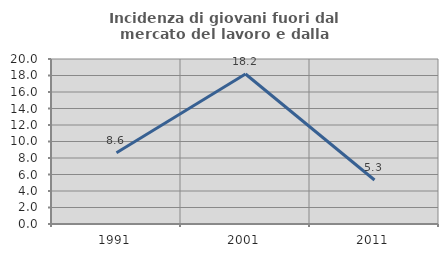
| Category | Incidenza di giovani fuori dal mercato del lavoro e dalla formazione  |
|---|---|
| 1991.0 | 8.642 |
| 2001.0 | 18.182 |
| 2011.0 | 5.333 |